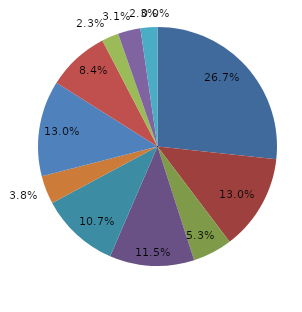
| Category | Series 0 |
|---|---|
| قبل الدخول | 26.718 |
| -1 | 12.977 |
| 1 | 5.344 |
| 2 | 11.45 |
| 3 | 10.687 |
| 4 | 3.817 |
|  5 - 9 | 12.977 |
|  10 - 14 | 8.397 |
|  15 - 19 | 2.29 |
|  20 - 24 | 3.053 |
| 25 + | 2.29 |
| غير مبين | 0 |